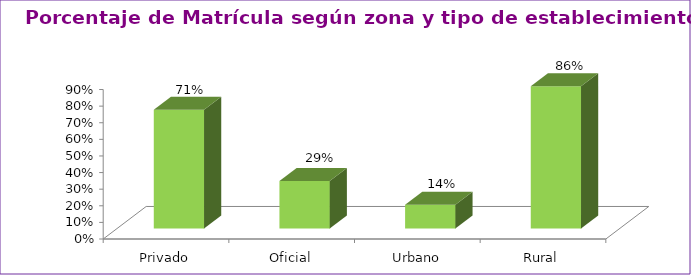
| Category | Series 1 |
|---|---|
| Privado | 0.714 |
| Oficial | 0.286 |
| Urbano | 0.143 |
| Rural | 0.857 |